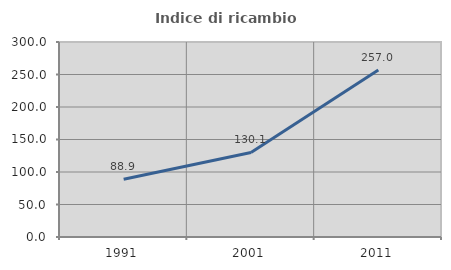
| Category | Indice di ricambio occupazionale  |
|---|---|
| 1991.0 | 88.942 |
| 2001.0 | 130.12 |
| 2011.0 | 257.025 |